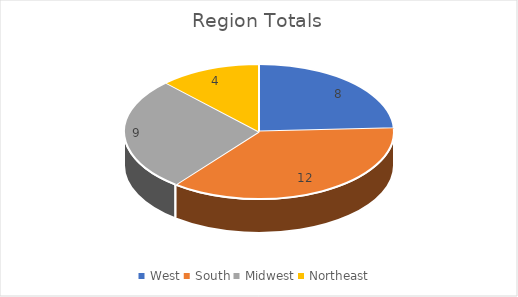
| Category | Totals |
|---|---|
| West | 8 |
| South | 12 |
| Midwest | 9 |
| Northeast | 4 |